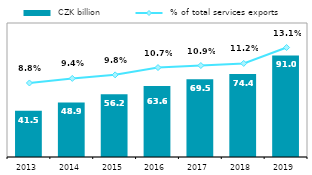
| Category |  CZK billion |
|---|---|
| 2013.0 | 41.49 |
| 2014.0 | 48.891 |
| 2015.0 | 56.164 |
| 2016.0 | 63.584 |
| 2017.0 | 69.518 |
| 2018.0 | 74.364 |
| 2019.0 | 91 |